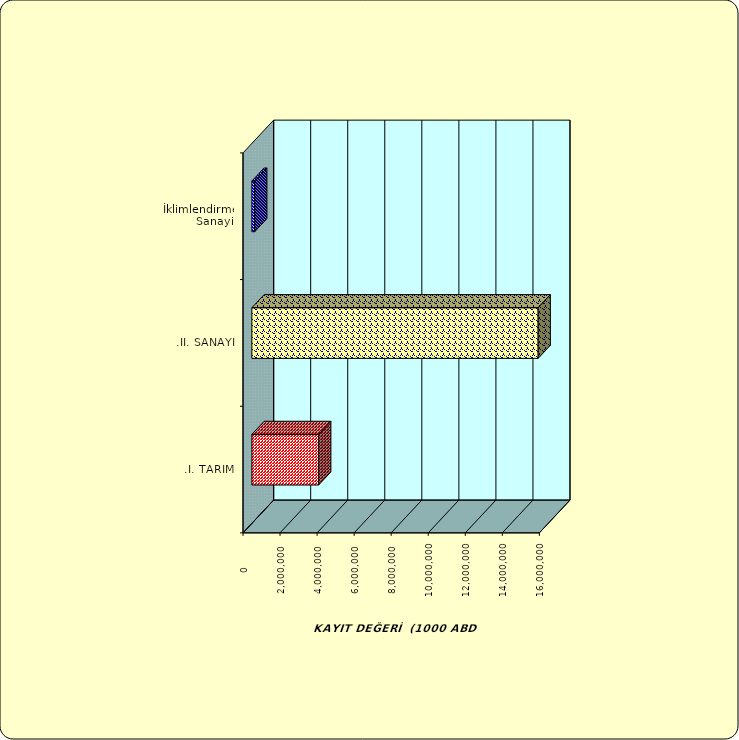
| Category | Series 0 |
|---|---|
| .I. TARIM | 3605552.459 |
| .II. SANAYİ | 15455593.982 |
|  İklimlendirme Sanayii | 152404.058 |